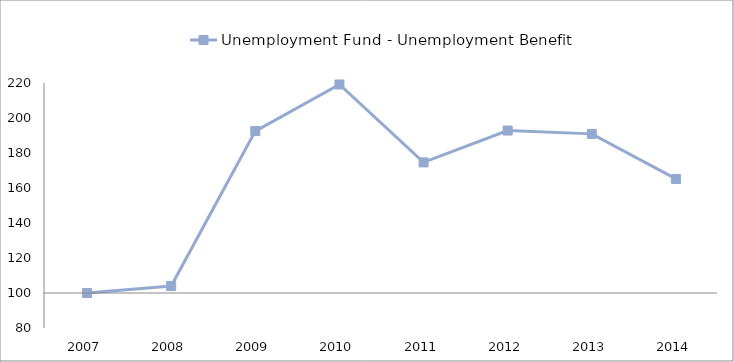
| Category | Unemployment Fund - Unemployment Benefit | 0 |
|---|---|---|
| 2007.0 | 100 |  |
| 2008.0 | 103.99 |  |
| 2009.0 | 192.53 |  |
| 2010.0 | 219.144 |  |
| 2011.0 | 174.635 |  |
| 2012.0 | 192.836 |  |
| 2013.0 | 190.931 |  |
| 2014.0 | 165.175 |  |